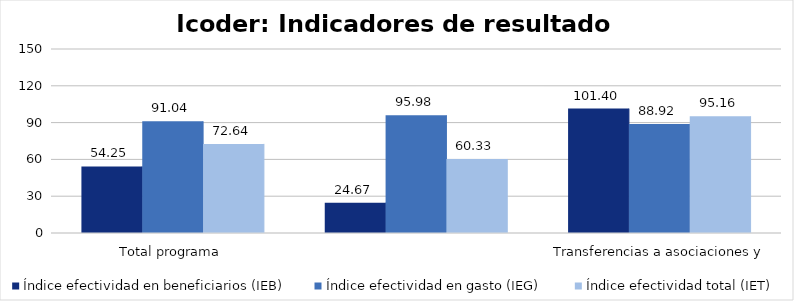
| Category | Índice efectividad en beneficiarios (IEB) | Índice efectividad en gasto (IEG)  | Índice efectividad total (IET) |
|---|---|---|---|
| Total programa | 54.246 | 91.042 | 72.644 |
| Transferencias a asociaciones y federaciones deportivas | 24.673 | 95.982 | 60.327 |
| Servicio de uso de parques e instalaciones deportivas | 101.405 | 88.925 | 95.165 |